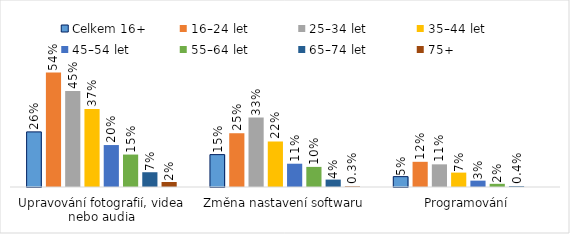
| Category | Celkem 16+ | 16–24 let | 25–34 let | 35–44 let | 45–54 let | 55–64 let | 65–74 let | 75+ |
|---|---|---|---|---|---|---|---|---|
| Upravování fotografií, videa nebo audia | 0.26 | 0.541 | 0.454 | 0.368 | 0.198 | 0.153 | 0.07 | 0.024 |
| Změna nastavení softwaru | 0.153 | 0.254 | 0.328 | 0.215 | 0.11 | 0.095 | 0.035 | 0.003 |
| Programování | 0.049 | 0.119 | 0.107 | 0.068 | 0.03 | 0.015 | 0.004 | 0 |